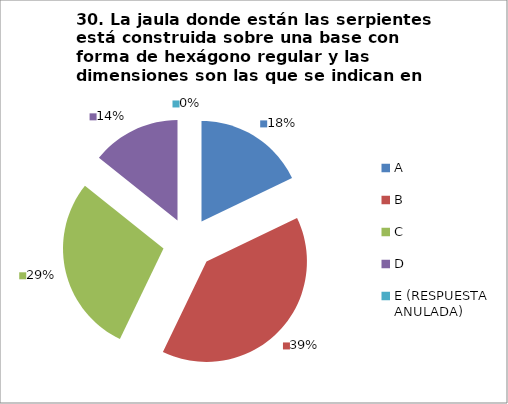
| Category | CANTIDAD DE RESPUESTAS PREGUNTA (30) | PORCENTAJE |
|---|---|---|
| A | 5 | 0.179 |
| B | 11 | 0.393 |
| C | 8 | 0.286 |
| D | 4 | 0.143 |
| E (RESPUESTA ANULADA) | 0 | 0 |